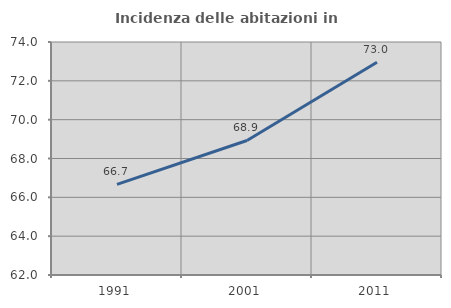
| Category | Incidenza delle abitazioni in proprietà  |
|---|---|
| 1991.0 | 66.667 |
| 2001.0 | 68.929 |
| 2011.0 | 72.953 |